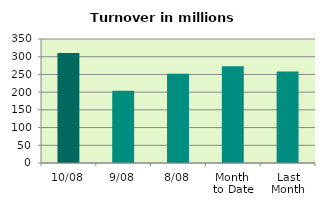
| Category | Series 0 |
|---|---|
| 10/08 | 310.505 |
| 9/08 | 204.04 |
| 8/08 | 252.118 |
| Month 
to Date | 273.009 |
| Last
Month | 258.125 |